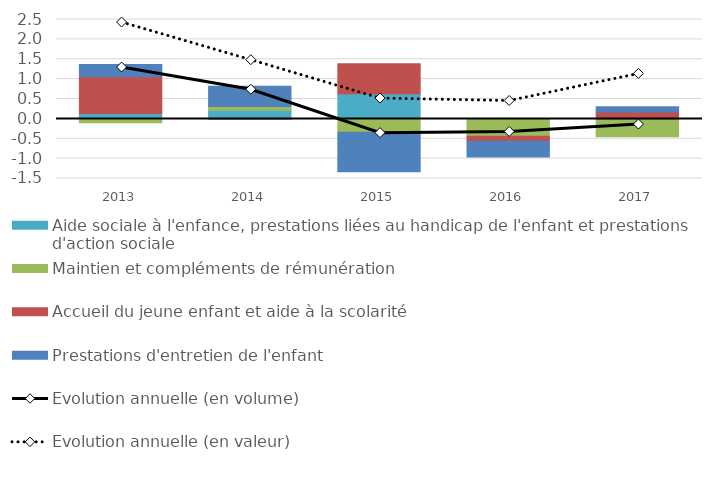
| Category | Aide sociale à l'enfance, prestations liées au handicap de l'enfant et prestations d'action sociale | Maintien et compléments de rémunération | Accueil du jeune enfant et aide à la scolarité | Prestations d'entretien de l'enfant |
|---|---|---|---|---|
| 2013.0 | 0.135 | -0.097 | 0.923 | 0.309 |
| 2014.0 | 0.219 | 0.09 | -0.002 | 0.511 |
| 2015.0 | 0.633 | -0.339 | 0.755 | -0.994 |
| 2016.0 | 0.003 | -0.435 | -0.126 | -0.4 |
| 2017.0 | 0 | -0.451 | 0.174 | 0.131 |